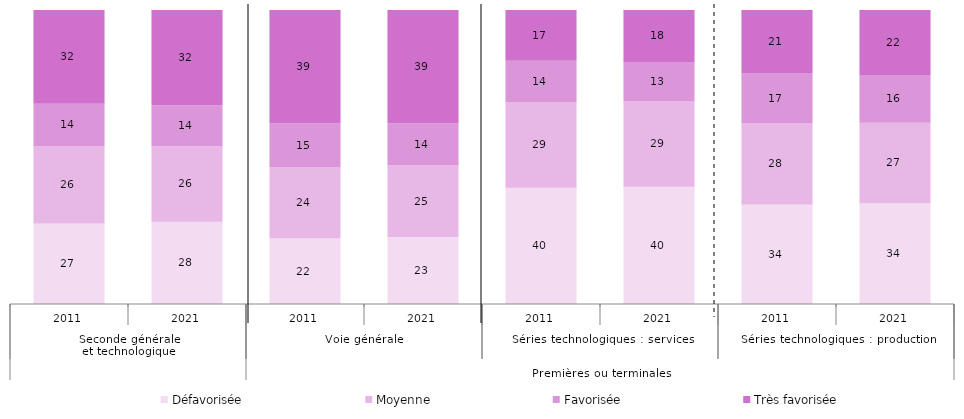
| Category | Défavorisée | Moyenne | Favorisée | Très favorisée |
|---|---|---|---|---|
| 0 | 27.42 | 26.28 | 14.44 | 31.86 |
| 1 | 27.979 | 25.693 | 13.944 | 32.384 |
| 2 | 22.33 | 24.24 | 14.84 | 38.59 |
| 3 | 22.755 | 24.524 | 14.179 | 38.542 |
| 4 | 39.54 | 29.19 | 14.02 | 17.25 |
| 5 | 39.863 | 29.215 | 13.263 | 17.659 |
| 6 | 33.86 | 27.68 | 17.03 | 21.43 |
| 7 | 34.291 | 27.347 | 16.276 | 22.086 |